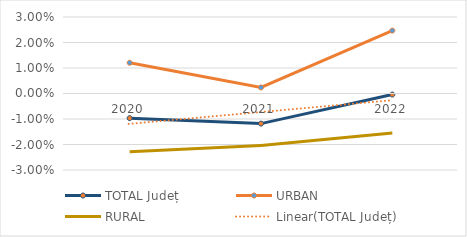
| Category | TOTAL Județ | URBAN | RURAL |
|---|---|---|---|
| 2020.0 | -0.01 | 0.012 | -0.023 |
| 2021.0 | -0.012 | 0.002 | -0.02 |
| 2022.0 | 0 | 0.025 | -0.015 |